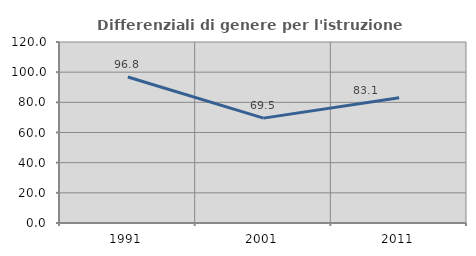
| Category | Differenziali di genere per l'istruzione superiore |
|---|---|
| 1991.0 | 96.809 |
| 2001.0 | 69.526 |
| 2011.0 | 83.073 |